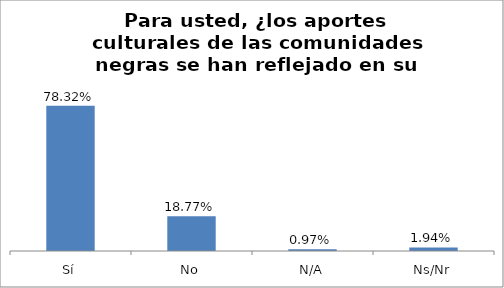
| Category | Total |
|---|---|
| Sí | 0.783 |
| No | 0.188 |
| N/A | 0.01 |
| Ns/Nr | 0.019 |